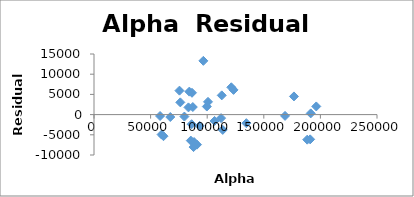
| Category | Series 0 |
|---|---|
| 93335.5 | -2793.457 |
| 85534.7 | -6430.281 |
| 87948.7 | -8042.091 |
| 90970.7 | -7442.917 |
| 88400.3 | -6794.126 |
| 86242.2 | -2383.069 |
| 79857.5 | -486.487 |
| 61388.6 | -5347.032 |
| 59704.0 | -4939.066 |
| 58356.1 | -349.241 |
| 67380.9 | -598.433 |
| 76250.0 | 3029.454 |
| 75493.9 | 5929.134 |
| 86570.0 | 5401.266 |
| 84231.8 | 5686.083 |
| 96598.9 | 13304.593 |
| 121289.1 | 6758.288 |
| 112854.8 | 4762.271 |
| 123265.0 | 6112.263 |
| 99658.21 | 1993.948 |
| 100713.6 | 3158.625 |
| 83452.9 | 1785.737 |
| 87284.2 | 1871.088 |
| 106531.1 | -1566.361 |
| 112286.4 | -871.429 |
| 113725.3 | -3790.428 |
| 134572.5 | -2120.119 |
| 168771.6 | -318.644 |
| 176649.1 | 4497.304 |
| 196354.6 | 2019.044 |
| 188372.3 | -6205.603 |
| 191449.8 | 295.875 |
| 190964.4 | -6126.193 |